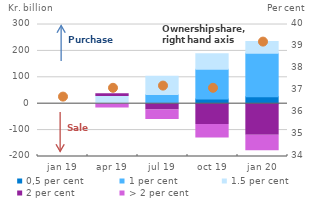
| Category | 0,5 per cent | 1 per cent | 1.5 per cent | 2 per cent | > 2 per cent |
|---|---|---|---|---|---|
| jan 19 | 0 | 0 | 0 | 0 | 0 |
| apr 19 | 0 | 0 | 26.8 | 10.5 | -16.5 |
| jul 19 | 0 | 35.2 | 69.2 | -23.9 | -36.2 |
| oct 19 | 17.6 | 113.1 | 58.1 | -78.7 | -51.5 |
| jan 20 | 26.5 | 164.2 | 45.1 | -119.1 | -58.9 |